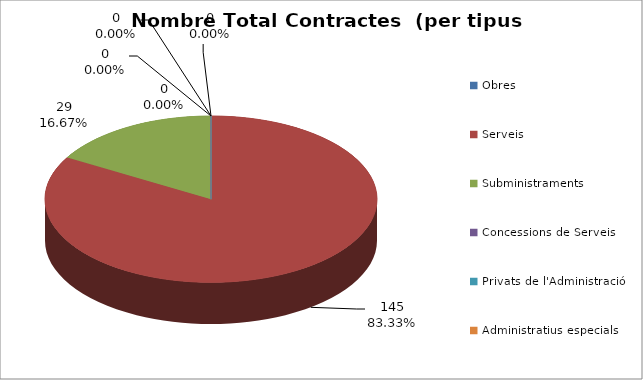
| Category | Nombre Total Contractes |
|---|---|
| Obres | 0 |
| Serveis | 145 |
| Subministraments | 29 |
| Concessions de Serveis | 0 |
| Privats de l'Administració | 0 |
| Administratius especials | 0 |